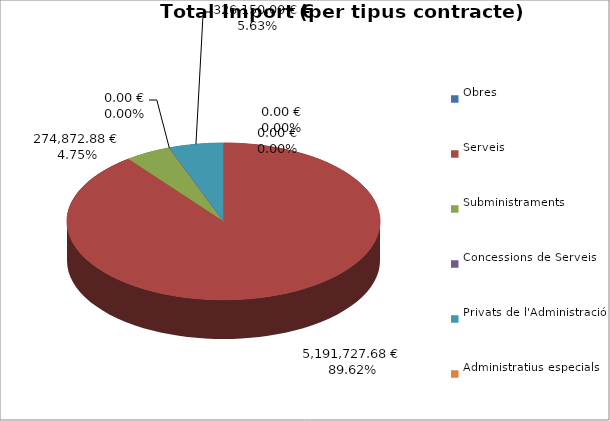
| Category | Total preu
(amb IVA) |
|---|---|
| Obres | 0 |
| Serveis | 5191727.68 |
| Subministraments | 274872.88 |
| Concessions de Serveis | 0 |
| Privats de l'Administració | 326150 |
| Administratius especials | 0 |